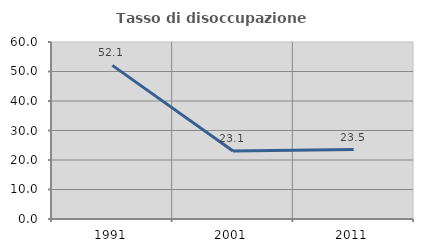
| Category | Tasso di disoccupazione giovanile  |
|---|---|
| 1991.0 | 52.083 |
| 2001.0 | 23.077 |
| 2011.0 | 23.529 |